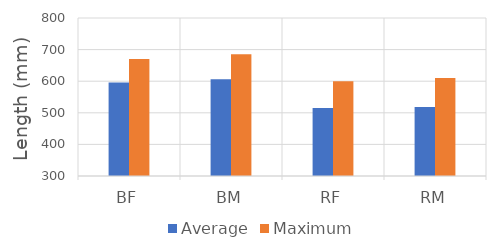
| Category | Average | Maximum |
|---|---|---|
| BF | 596 | 670 |
| BM | 605.784 | 685 |
| RF | 515.125 | 600 |
| RM | 518.659 | 610 |